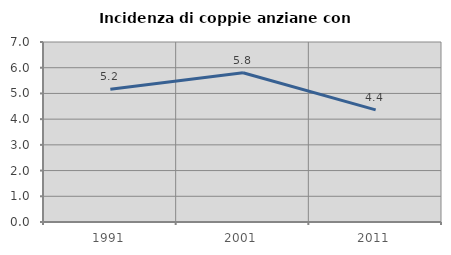
| Category | Incidenza di coppie anziane con figli |
|---|---|
| 1991.0 | 5.166 |
| 2001.0 | 5.802 |
| 2011.0 | 4.362 |